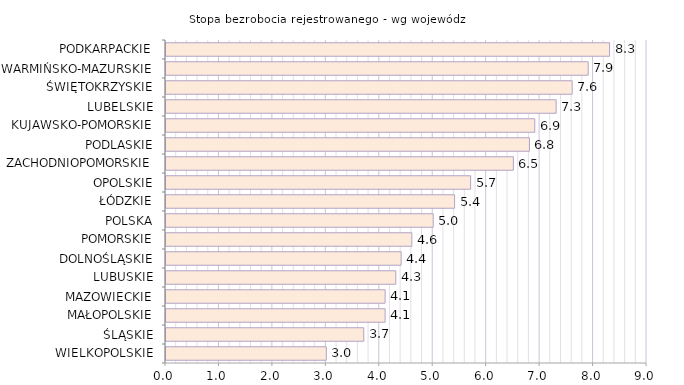
| Category | Stopa bezrobocia rejestrowanego - wg województw |
|---|---|
| WIELKOPOLSKIE | 3 |
| ŚLĄSKIE | 3.7 |
| MAŁOPOLSKIE | 4.1 |
| MAZOWIECKIE | 4.1 |
| LUBUSKIE | 4.3 |
| DOLNOŚLĄSKIE | 4.4 |
| POMORSKIE | 4.6 |
| POLSKA | 5 |
| ŁÓDZKIE | 5.4 |
| OPOLSKIE | 5.7 |
| ZACHODNIOPOMORSKIE | 6.5 |
| PODLASKIE | 6.8 |
| KUJAWSKO-POMORSKIE | 6.9 |
| LUBELSKIE | 7.3 |
| ŚWIĘTOKRZYSKIE | 7.6 |
| WARMIŃSKO-MAZURSKIE | 7.9 |
| PODKARPACKIE | 8.3 |